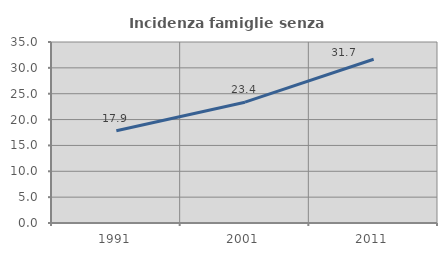
| Category | Incidenza famiglie senza nuclei |
|---|---|
| 1991.0 | 17.855 |
| 2001.0 | 23.364 |
| 2011.0 | 31.66 |